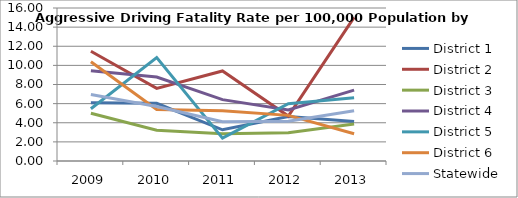
| Category | District 1 | District 2 | District 3 | District 4 | District 5 | District 6 | Statewide |
|---|---|---|---|---|---|---|---|
| 2009.0 | 6.084 | 11.484 | 4.995 | 9.445 | 5.47 | 10.372 | 6.956 |
| 2010.0 | 6.041 | 7.589 | 3.208 | 8.774 | 10.808 | 5.379 | 5.693 |
| 2011.0 | 3.262 | 9.415 | 2.855 | 6.417 | 2.391 | 5.256 | 4.103 |
| 2012.0 | 4.641 | 4.695 | 2.956 | 5.343 | 5.997 | 4.773 | 4.164 |
| 2013.0 | 4.137 | 15.011 | 3.876 | 7.413 | 6.621 | 2.85 | 5.264 |